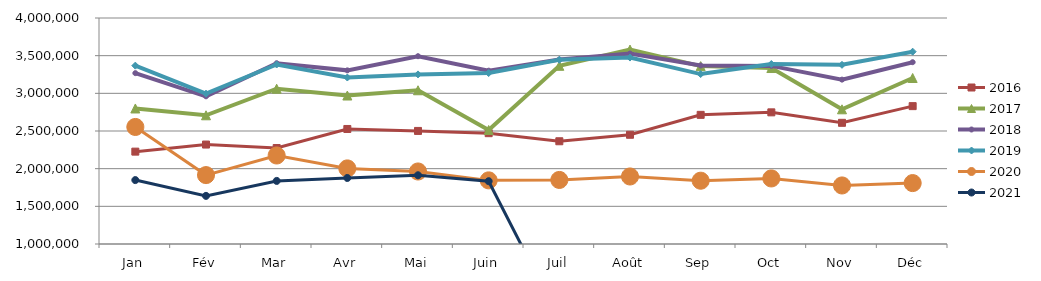
| Category | 2015 | 2016 | 2017 | 2018 | 2019 | 2020 | 2021 |
|---|---|---|---|---|---|---|---|
| Jan |  | 2226093.309 | 2798915.391 | 3268127.156 | 3367510.542 | 2553542.465 | 1848435.265 |
| Fév |  | 2320135.002 | 2708507.11 | 2960518.709 | 2995707.194 | 1914783.421 | 1639009.953 |
| Mar |  | 2274111.99 | 3061215.361 | 3399788.443 | 3382590.899 | 2175089.683 | 1837369.769 |
| Avr |  | 2526794.87 | 2970911.094 | 3304906.324 | 3209954.832 | 2003293.895 | 1876404.979 |
| Mai |  | 2500868.782 | 3040805.262 | 3492911.082 | 3251146.092 | 1962510.702 | 1912345.285 |
| Juin |  | 2471115.702 | 2513480.318 | 3300924.802 | 3269085.474 | 1844603.728 | 1833702.622 |
| Juil |  | 2363852.978 | 3365511.031 | 3448603.566 | 3445052.713 | 1850370.172 | 0 |
| Août |  | 2449927.953 | 3580436.797 | 3528173.012 | 3474993.525 | 1896365.756 | 0 |
| Sep |  | 2714390.875 | 3361524.335 | 3369626.193 | 3255644.054 | 1840205.182 | 0 |
| Oct |  | 2747632.929 | 3335934.501 | 3364260.879 | 3388972.2 | 1870450.237 | 0 |
| Nov |  | 2608583.302 | 2787992.168 | 3181888.576 | 3378477.919 | 1777011.858 | 0 |
| Déc |  | 2830164.13 | 3203732.398 | 3413454.996 | 3552894.26 | 1808480.012 | 0 |